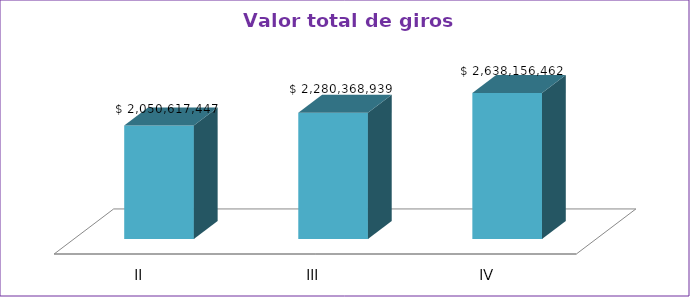
| Category | Series 0 |
|---|---|
| II | 2050617447 |
| III | 2280368939 |
| IV | 2638156462 |